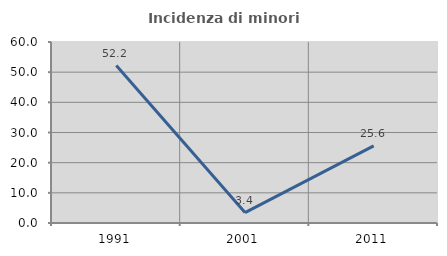
| Category | Incidenza di minori stranieri |
|---|---|
| 1991.0 | 52.174 |
| 2001.0 | 3.448 |
| 2011.0 | 25.581 |